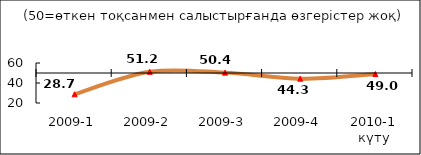
| Category | Диф.индекс ↓ |
|---|---|
| 2009-1 | 28.72 |
| 2009-2 | 51.18 |
| 2009-3 | 50.375 |
| 2009-4 | 44.335 |
| 2010-1 күту | 48.99 |